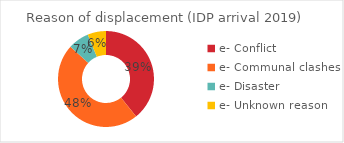
| Category | Series 0 |
|---|---|
| e- Conflict | 59010 |
| e- Communal clashes | 71504 |
| e- Disaster | 10621 |
| e- Unknown reason | 9335 |